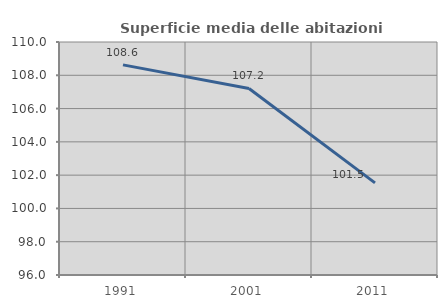
| Category | Superficie media delle abitazioni occupate |
|---|---|
| 1991.0 | 108.626 |
| 2001.0 | 107.207 |
| 2011.0 | 101.535 |